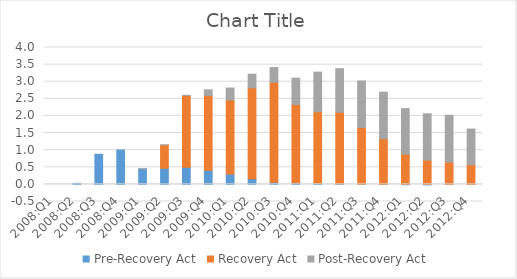
| Category | Pre-Recovery Act | Recovery Act | Post-Recovery Act |
|---|---|---|---|
| 2008:Q1 | 0 | 0 | 0 |
| 2008:Q2 | 0.031 | 0 | 0 |
| 2008:Q3 | 0.878 | 0 | 0 |
| 2008:Q4 | 1.004 | 0 | 0 |
| 2009:Q1 | 0.453 | 0 | 0.002 |
| 2009:Q2 | 0.47 | 0.678 | 0.004 |
| 2009:Q3 | 0.499 | 2.098 | 0.004 |
| 2009:Q4 | 0.411 | 2.189 | 0.163 |
| 2010:Q1 | 0.302 | 2.165 | 0.349 |
| 2010:Q2 | 0.161 | 2.664 | 0.395 |
| 2010:Q3 | 0.06 | 2.925 | 0.43 |
| 2010:Q4 | 0.04 | 2.293 | 0.77 |
| 2011:Q1 | 0.027 | 2.097 | 1.158 |
| 2011:Q2 | 0.016 | 2.093 | 1.274 |
| 2011:Q3 | 0.006 | 1.656 | 1.359 |
| 2011:Q4 | 0.004 | 1.331 | 1.359 |
| 2012:Q1 | -0.011 | 0.883 | 1.331 |
| 2012:Q2 | -0.014 | 0.709 | 1.353 |
| 2012:Q3 | 0.001 | 0.649 | 1.37 |
| 2012:Q4 | 0.001 | 0.574 | 1.042 |